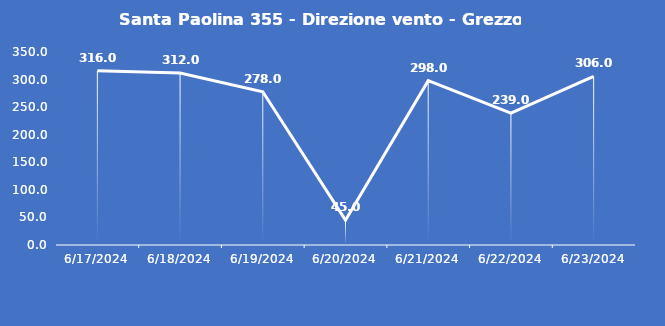
| Category | Santa Paolina 355 - Direzione vento - Grezzo (°N) |
|---|---|
| 6/17/24 | 316 |
| 6/18/24 | 312 |
| 6/19/24 | 278 |
| 6/20/24 | 45 |
| 6/21/24 | 298 |
| 6/22/24 | 239 |
| 6/23/24 | 306 |